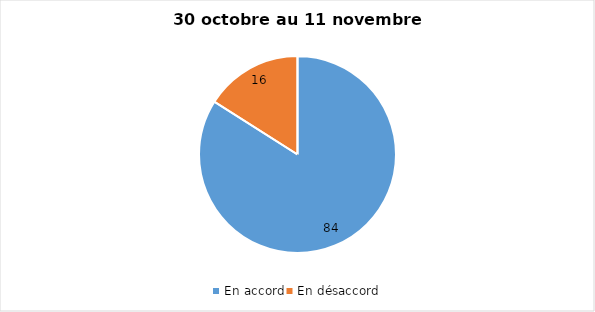
| Category | Series 0 |
|---|---|
| En accord | 84 |
| En désaccord | 16 |